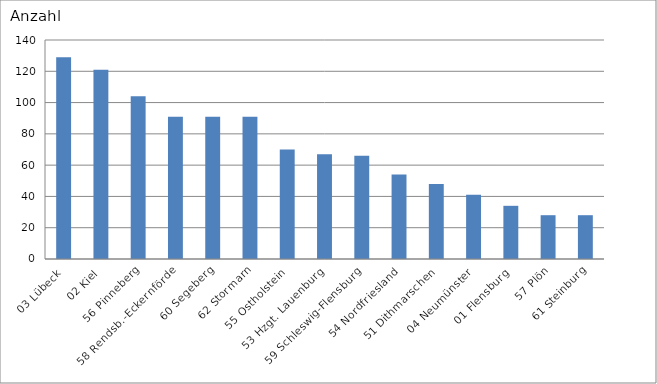
| Category | 03 Lübeck 02 Kiel 56 Pinneberg 58 Rendsb.-Eckernförde 60 Segeberg 62 Stormarn 55 Ostholstein 53 Hzgt. Lauenburg 59 Schleswig-Flensburg 54 Nordfriesland 51 Dithmarschen 04 Neumünster 01 Flensburg 57 Plön 61 Steinburg |
|---|---|
| 03 Lübeck | 129 |
| 02 Kiel | 121 |
| 56 Pinneberg | 104 |
| 58 Rendsb.-Eckernförde | 91 |
| 60 Segeberg | 91 |
| 62 Stormarn | 91 |
| 55 Ostholstein | 70 |
| 53 Hzgt. Lauenburg | 67 |
| 59 Schleswig-Flensburg | 66 |
| 54 Nordfriesland | 54 |
| 51 Dithmarschen | 48 |
| 04 Neumünster | 41 |
| 01 Flensburg | 34 |
| 57 Plön | 28 |
| 61 Steinburg | 28 |